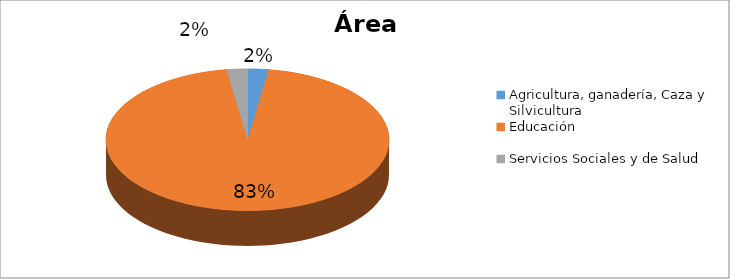
| Category | Series 0 |
|---|---|
| Agricultura, ganadería, Caza y Silvicultura | 0.021 |
| Educación | 0.833 |
| Servicios Sociales y de Salud | 0.021 |